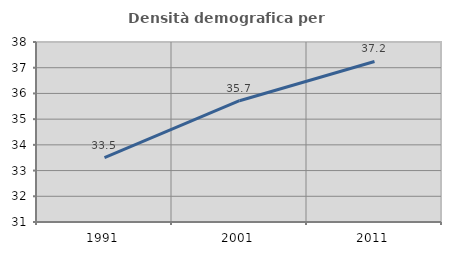
| Category | Densità demografica |
|---|---|
| 1991.0 | 33.505 |
| 2001.0 | 35.717 |
| 2011.0 | 37.243 |